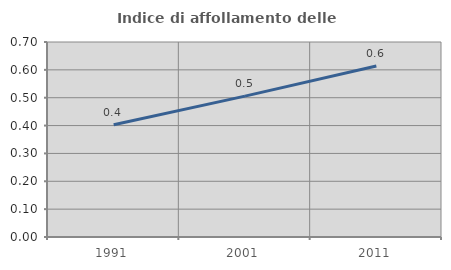
| Category | Indice di affollamento delle abitazioni  |
|---|---|
| 1991.0 | 0.403 |
| 2001.0 | 0.506 |
| 2011.0 | 0.614 |